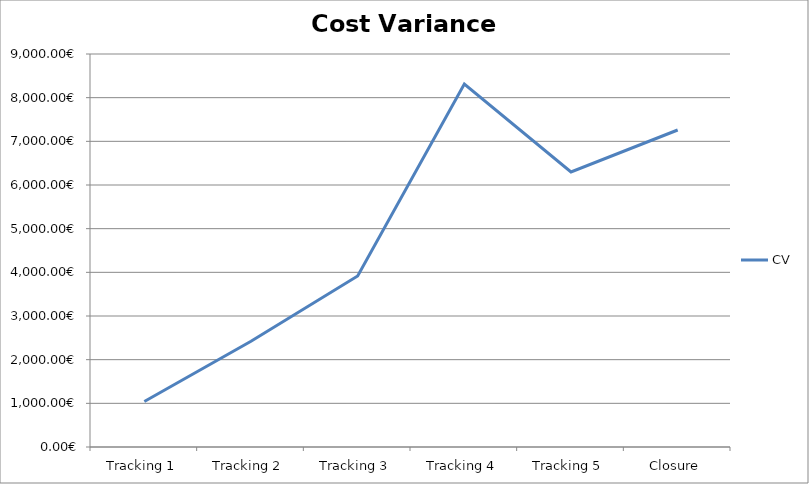
| Category | CV |
|---|---|
| Tracking 1 | 1042.2 |
| Tracking 2 | 2421.75 |
| Tracking 3 | 3917.4 |
| Tracking 4 | 8312.1 |
| Tracking 5 | 6297.45 |
| Closure | 7260 |